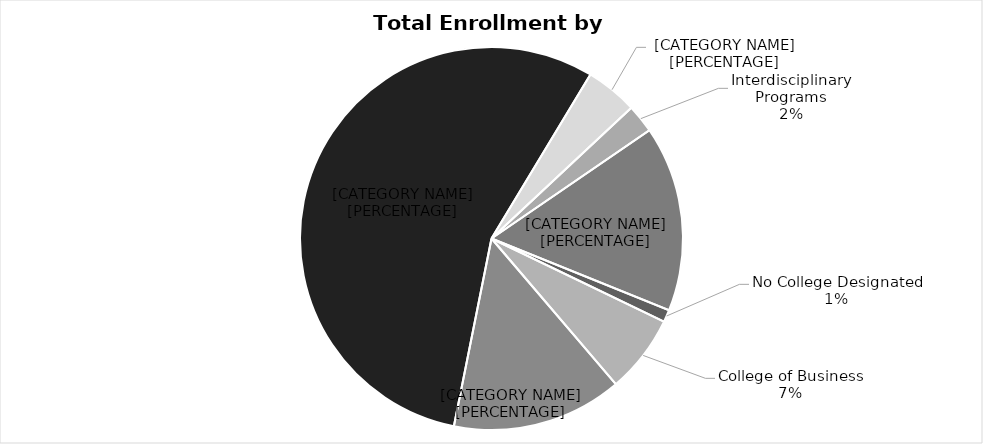
| Category | Enrollment by College |
|---|---|
| No College Designated | 76 |
| College of Business | 484 |
| College of Computing | 1054 |
| College of Engineering | 4064 |
| College of For Res & Env Sci | 322 |
| Interdisciplinary Programs | 176 |
| College of Sciences & Arts | 1148 |